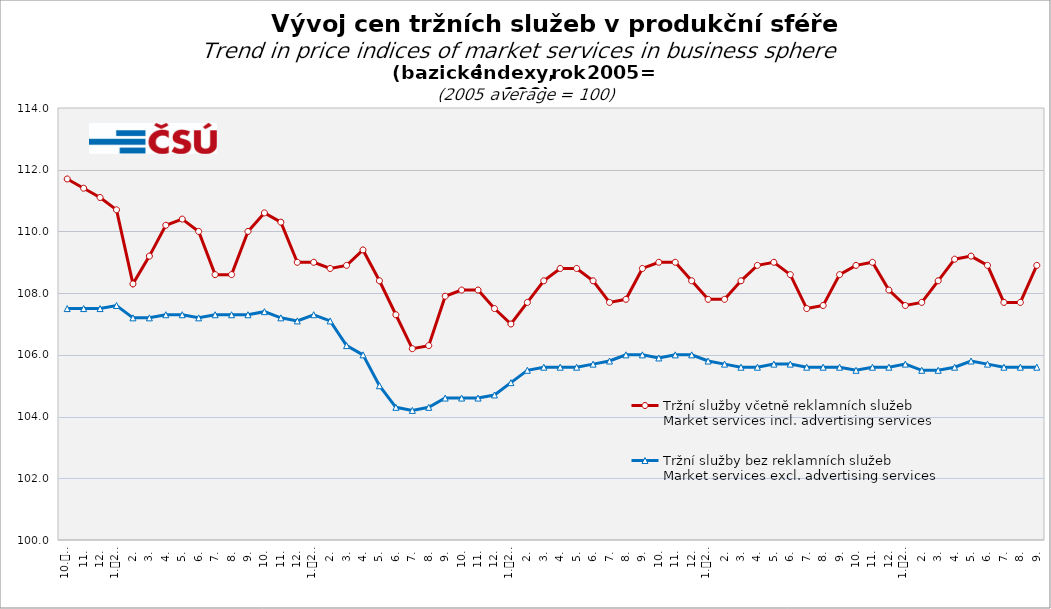
| Category | Tržní služby včetně reklamních služeb
Market services incl. advertising services | Tržní služby bez reklamních služeb
Market services excl. advertising services |
|---|---|---|
| 0 | 111.7 | 107.5 |
| 1 | 111.4 | 107.5 |
| 2 | 111.1 | 107.5 |
| 3 | 110.7 | 107.6 |
| 4 | 108.3 | 107.2 |
| 5 | 109.2 | 107.2 |
| 6 | 110.2 | 107.3 |
| 7 | 110.4 | 107.3 |
| 8 | 110 | 107.2 |
| 9 | 108.6 | 107.3 |
| 10 | 108.6 | 107.3 |
| 11 | 110 | 107.3 |
| 12 | 110.6 | 107.4 |
| 13 | 110.3 | 107.2 |
| 14 | 109 | 107.1 |
| 15 | 109 | 107.3 |
| 16 | 108.8 | 107.1 |
| 17 | 108.9 | 106.3 |
| 18 | 109.4 | 106 |
| 19 | 108.4 | 105 |
| 20 | 107.3 | 104.3 |
| 21 | 106.2 | 104.2 |
| 22 | 106.3 | 104.3 |
| 23 | 107.9 | 104.6 |
| 24 | 108.1 | 104.6 |
| 25 | 108.1 | 104.6 |
| 26 | 107.5 | 104.7 |
| 27 | 107 | 105.1 |
| 28 | 107.7 | 105.5 |
| 29 | 108.4 | 105.6 |
| 30 | 108.8 | 105.6 |
| 31 | 108.8 | 105.6 |
| 32 | 108.4 | 105.7 |
| 33 | 107.7 | 105.8 |
| 34 | 107.8 | 106 |
| 35 | 108.8 | 106 |
| 36 | 109 | 105.9 |
| 37 | 109 | 106 |
| 38 | 108.4 | 106 |
| 39 | 107.8 | 105.8 |
| 40 | 107.8 | 105.7 |
| 41 | 108.4 | 105.6 |
| 42 | 108.9 | 105.6 |
| 43 | 109 | 105.7 |
| 44 | 108.6 | 105.7 |
| 45 | 107.5 | 105.6 |
| 46 | 107.6 | 105.6 |
| 47 | 108.6 | 105.6 |
| 48 | 108.9 | 105.5 |
| 49 | 109 | 105.6 |
| 50 | 108.1 | 105.6 |
| 51 | 107.6 | 105.7 |
| 52 | 107.7 | 105.5 |
| 53 | 108.4 | 105.5 |
| 54 | 109.1 | 105.6 |
| 55 | 109.2 | 105.8 |
| 56 | 108.9 | 105.7 |
| 57 | 107.7 | 105.6 |
| 58 | 107.7 | 105.6 |
| 59 | 108.9 | 105.6 |